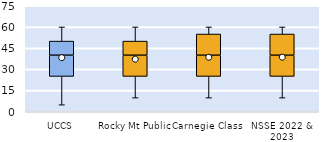
| Category | 25th | 50th | 75th |
|---|---|---|---|
| UCCS | 25 | 15 | 10 |
| Rocky Mt Public | 25 | 15 | 10 |
| Carnegie Class | 25 | 15 | 15 |
| NSSE 2022 & 2023 | 25 | 15 | 15 |